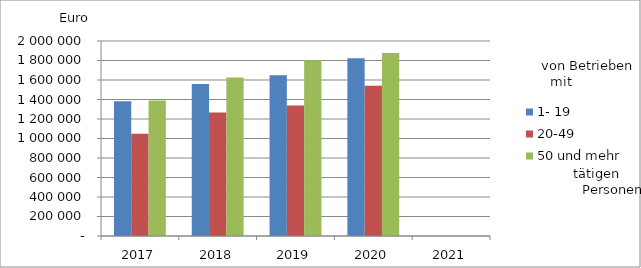
| Category | 1- 19 | 20-49 | 50 und mehr |
|---|---|---|---|
| 2017.0 | 1382676.934 | 1049790.605 | 1390739.609 |
| 2018.0 | 1559767.804 | 1267721.312 | 1625033.088 |
| 2019.0 | 1648400.936 | 1337797.111 | 1803544.827 |
| 2020.0 | 1822443.621 | 1541387.368 | 1875679.649 |
| 2021.0 | 0 | 0 | 0 |